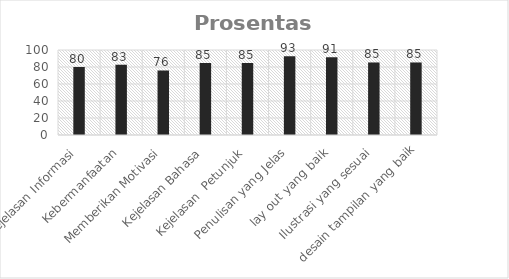
| Category | Prosentase |
|---|---|
| Kejelasan Informasi | 80 |
| Kebermanfaatan | 82.667 |
| Memberikan Motivasi | 76 |
| Kejelasan Bahasa | 84.667 |
| Kejelasan  Petunjuk | 84.667 |
| Penulisan yang Jelas | 92.667 |
| lay out yang baik | 91.333 |
| Ilustrasi yang sesuai | 85.333 |
| desain tampilan yang baik | 85.333 |